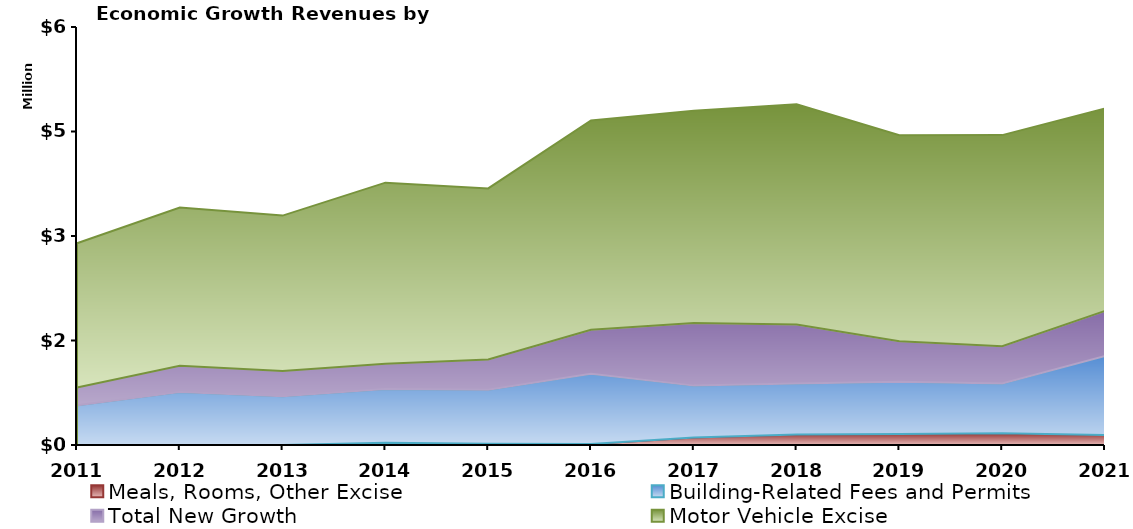
| Category | Meals, Rooms, Other Excise | Building-Related Fees and Permits | Total New Growth | Motor Vehicle Excise |
|---|---|---|---|---|
| 2011.0 | 0 | 569512 | 254454 | 2071180 |
| 2012.0 | 0 | 761337 | 377546 | 2270407 |
| 2013.0 | 0 | 698006 | 365596 | 2229176 |
| 2014.0 | 31575 | 772351 | 362549 | 2599183 |
| 2015.0 | 18528 | 774761 | 434274 | 2455909 |
| 2016.0 | 15728 | 1006367 | 631476 | 3003973 |
| 2017.0 | 108990 | 743314 | 898607 | 3045619 |
| 2018.0 | 149155 | 734229 | 845923 | 3162161 |
| 2019.0 | 158090 | 750917 | 580235 | 2956253 |
| 2020.0 | 170198 | 712430 | 536363 | 3029062 |
| 2021.0 | 142845 | 1135192 | 646133 | 2905384 |